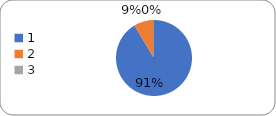
| Category | Series 0 |
|---|---|
| 0 | 85 |
| 1 | 8 |
| 2 | 0 |